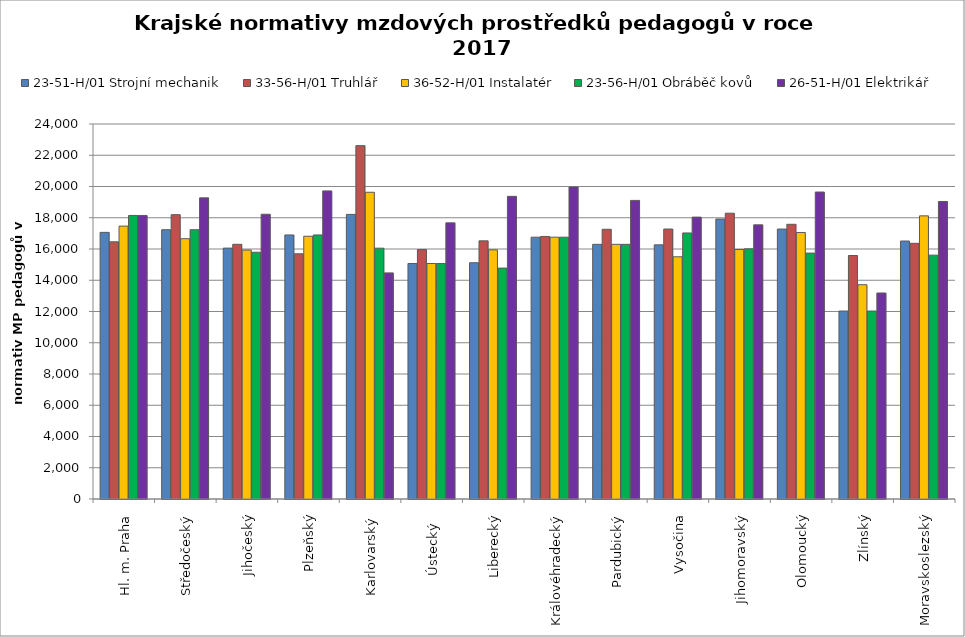
| Category | 23-51-H/01 Strojní mechanik | 33-56-H/01 Truhlář | 36-52-H/01 Instalatér | 23-56-H/01 Obráběč kovů | 26-51-H/01 Elektrikář |
|---|---|---|---|---|---|
| Hl. m. Praha | 17064.22 | 16460.177 | 17464.789 | 18146.341 | 18146.341 |
| Středočeský | 17234.897 | 18196.537 | 16659.779 | 17234.897 | 19273.545 |
| Jihočeský | 16056.743 | 16299.915 | 15934.283 | 15792.582 | 18223.456 |
| Plzeňský | 16899.367 | 15692.269 | 16815.669 | 16899.367 | 19718.902 |
| Karlovarský  | 18214.858 | 22614.466 | 19631.336 | 16052.756 | 14471.338 |
| Ústecký   | 15072.355 | 15961.826 | 15072.355 | 15072.355 | 17672.894 |
| Liberecký | 15120.788 | 16520.417 | 15945.498 | 14777.667 | 19369.208 |
| Královéhradecký | 16756.098 | 16803.387 | 16756.098 | 16756.098 | 19968.698 |
| Pardubický | 16298.524 | 17261.944 | 16298.524 | 16298.524 | 19110.438 |
| Vysočina | 16264.028 | 17278.042 | 15501.356 | 17026.344 | 18040.894 |
| Jihomoravský | 17917.992 | 18290.876 | 15968.422 | 16008.718 | 17546.311 |
| Olomoucký | 17276.051 | 17581.395 | 17057.762 | 15736.886 | 19646.57 |
| Zlínský | 12029.053 | 15583.091 | 13713.12 | 12029.053 | 13185.692 |
| Moravskoslezský | 16510.103 | 16363.151 | 18121.242 | 15606.112 | 19040.911 |